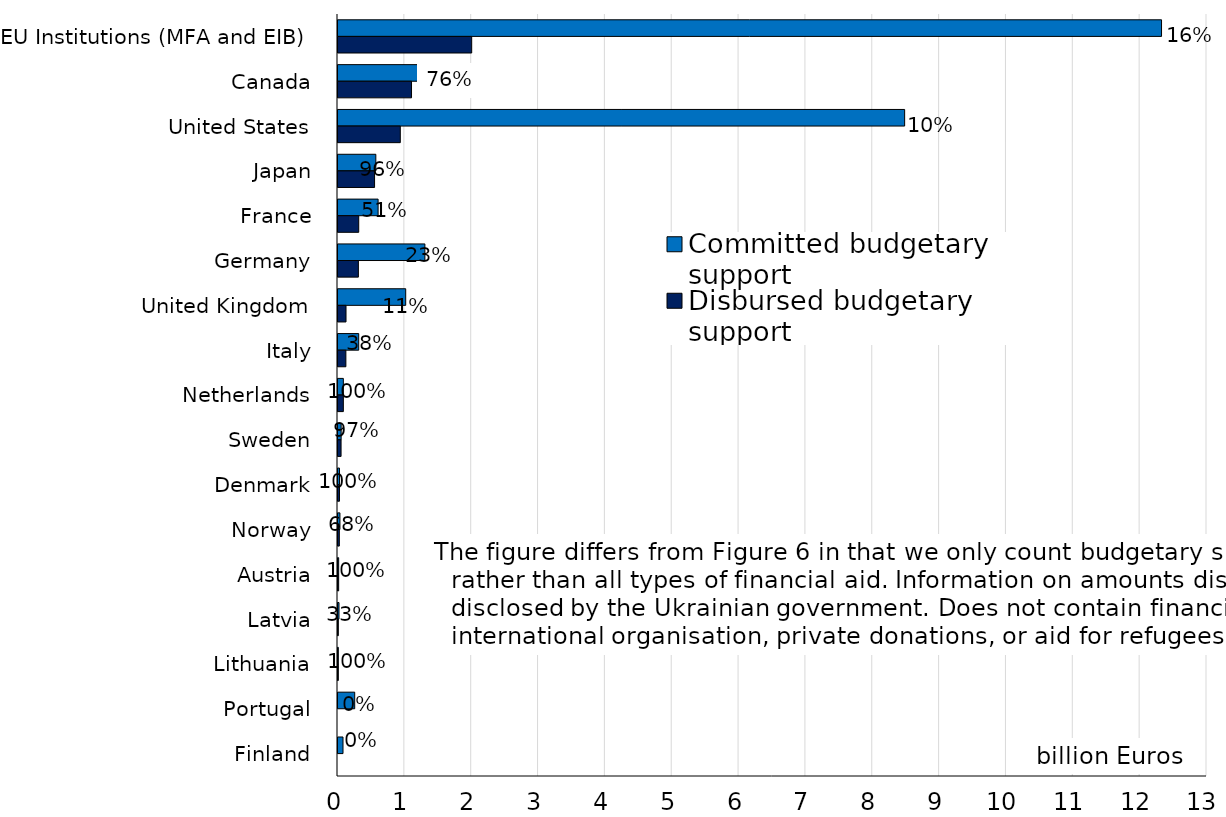
| Category | Committed budgetary support | Disbursed budgetary support |
|---|---|---|
| EU Institutions (MFA and EIB) | 12.32 | 2 |
| Canada | 1.437 | 1.1 |
| United States | 8.477 | 0.932 |
| Japan | 0.566 | 0.547 |
| France | 0.6 | 0.31 |
| Germany | 1.3 | 0.305 |
| United Kingdom | 1.013 | 0.12 |
| Italy | 0.31 | 0.118 |
| Netherlands | 0.08 | 0.08 |
| Sweden | 0.047 | 0.046 |
| Denmark | 0.022 | 0.022 |
| Norway | 0.029 | 0.02 |
| Austria | 0.01 | 0.01 |
| Latvia | 0.015 | 0.005 |
| Lithuania | 0.005 | 0.005 |
| Portugal | 0.25 | 0 |
| Finland | 0.075 | 0 |